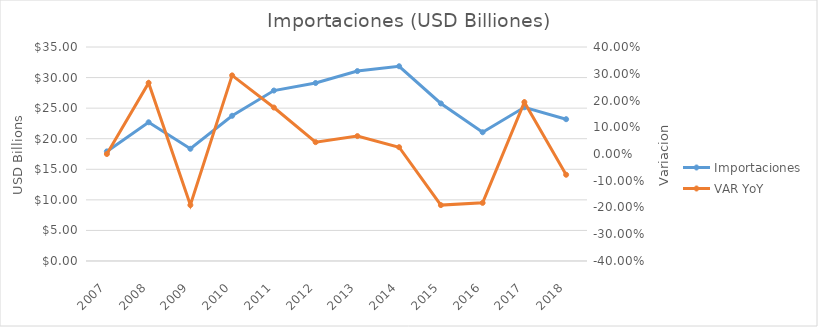
| Category | Importaciones |
|---|---|
| 2007.0 | 17.924 |
| 2008.0 | 22.688 |
| 2009.0 | 18.356 |
| 2010.0 | 23.751 |
| 2011.0 | 27.877 |
| 2012.0 | 29.111 |
| 2013.0 | 31.06 |
| 2014.0 | 31.85 |
| 2015.0 | 25.766 |
| 2016.0 | 21.059 |
| 2017.0 | 25.142 |
| 2018.0 | 23.193 |